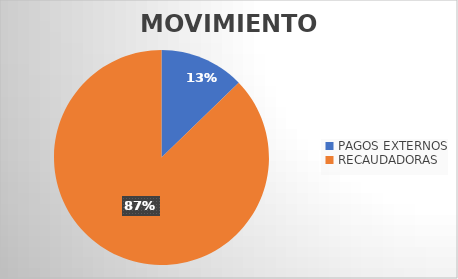
| Category | MOVIMIENTOS |
|---|---|
| PAGOS EXTERNOS | 7986 |
| RECAUDADORAS | 54642 |